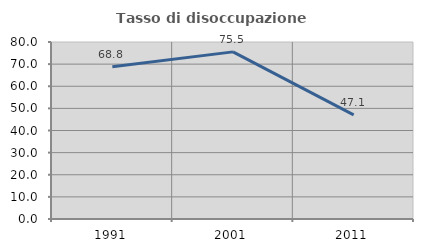
| Category | Tasso di disoccupazione giovanile  |
|---|---|
| 1991.0 | 68.847 |
| 2001.0 | 75.532 |
| 2011.0 | 47.059 |